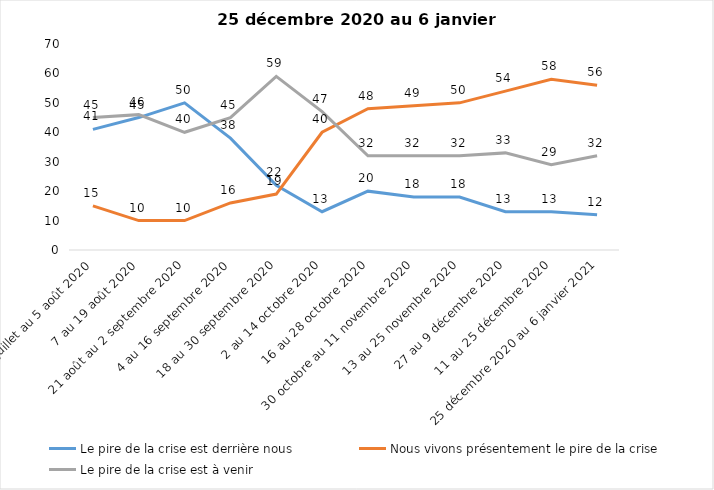
| Category | Le pire de la crise est derrière nous | Nous vivons présentement le pire de la crise | Le pire de la crise est à venir |
|---|---|---|---|
| 24 juillet au 5 août 2020 | 41 | 15 | 45 |
| 7 au 19 août 2020 | 45 | 10 | 46 |
| 21 août au 2 septembre 2020 | 50 | 10 | 40 |
| 4 au 16 septembre 2020 | 38 | 16 | 45 |
| 18 au 30 septembre 2020 | 22 | 19 | 59 |
| 2 au 14 octobre 2020 | 13 | 40 | 47 |
| 16 au 28 octobre 2020 | 20 | 48 | 32 |
| 30 octobre au 11 novembre 2020 | 18 | 49 | 32 |
| 13 au 25 novembre 2020 | 18 | 50 | 32 |
| 27 au 9 décembre 2020 | 13 | 54 | 33 |
| 11 au 25 décembre 2020 | 13 | 58 | 29 |
| 25 décembre 2020 au 6 janvier 2021 | 12 | 56 | 32 |